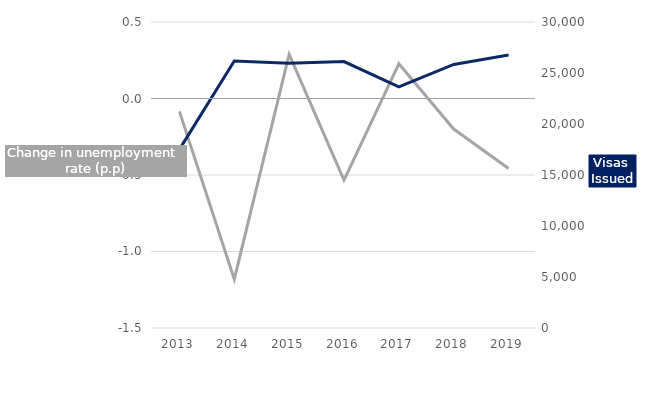
| Category | Change in unemployment rate for top 4 ICT SOCs (p.p) |
|---|---|
| 2013.0 | -0.084 |
| 2014.0 | -1.181 |
| 2015.0 | 0.288 |
| 2016.0 | -0.533 |
| 2017.0 | 0.227 |
| 2018.0 | -0.2 |
| 2019.0 | -0.457 |